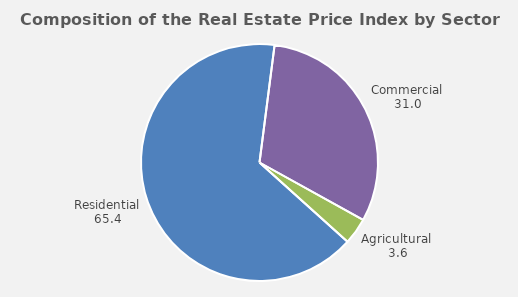
| Category | Series 0 |
|---|---|
| Residential | 65.37 |
| Commercial | 31.02 |
| Agricultural  | 3.61 |